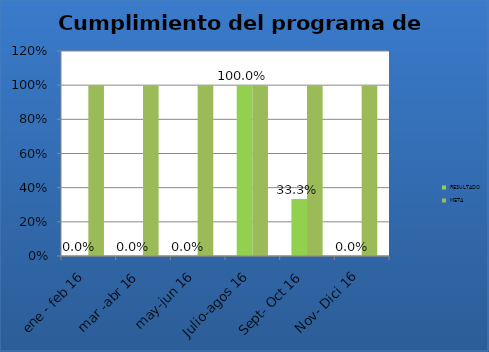
| Category | RESULTADO | META |
|---|---|---|
| ene - feb 16 | 0 | 1 |
| mar -abr 16 | 0 | 1 |
| may-jun 16 | 0 | 1 |
| Julio-agos 16 | 1 | 1 |
| Sept- Oct 16 | 0.333 | 1 |
| Nov- Dici 16 | 0 | 1 |